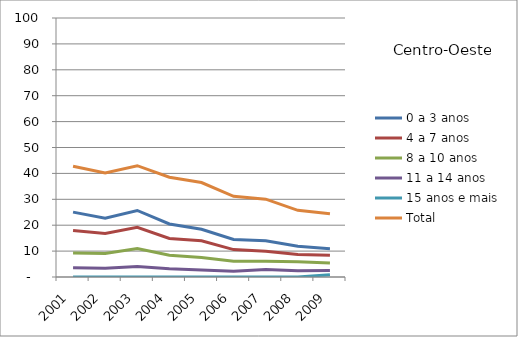
| Category | 0 a 3 anos | 4 a 7 anos | 8 a 10 anos | 11 a 14 anos | 15 anos e mais | Total |
|---|---|---|---|---|---|---|
| 2001.0 | 25.04 | 17.98 | 9.29 | 3.6 | 0 | 42.79 |
| 2002.0 | 22.69 | 16.76 | 9.05 | 3.37 | 0 | 40.18 |
| 2003.0 | 25.69 | 19.21 | 11.02 | 4.01 | 0 | 42.97 |
| 2004.0 | 20.48 | 14.9 | 8.41 | 3.23 | 0 | 38.51 |
| 2005.0 | 18.45 | 14.02 | 7.55 | 2.75 | 0 | 36.48 |
| 2006.0 | 14.47 | 10.58 | 6.08 | 2.19 | 0 | 31.17 |
| 2007.0 | 14.03 | 9.9 | 6.12 | 2.85 | 0 | 30.05 |
| 2008.0 | 11.85 | 8.69 | 5.9 | 2.38 | 0 | 25.73 |
| 2009.0 | 10.94 | 8.36 | 5.39 | 2.5 | 0.91 | 24.41 |